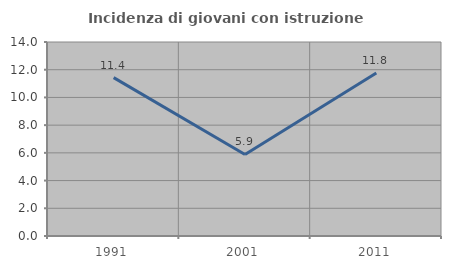
| Category | Incidenza di giovani con istruzione universitaria |
|---|---|
| 1991.0 | 11.429 |
| 2001.0 | 5.882 |
| 2011.0 | 11.765 |